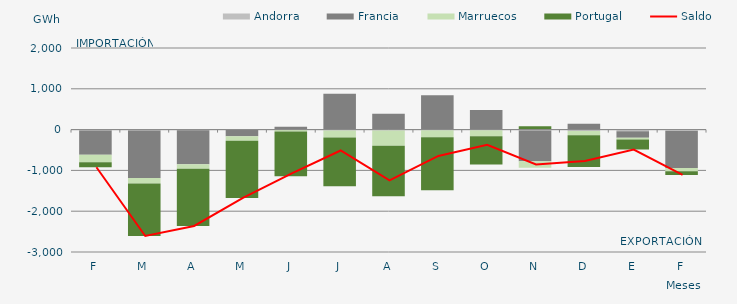
| Category | Andorra | Francia | Marruecos | Portugal |
|---|---|---|---|---|
| F | -21.206 | -592.499 | -187.112 | -122.026 |
| M | -23.108 | -1163.333 | -133.704 | -1286.701 |
| A | -14.627 | -836.505 | -105.478 | -1404.431 |
| M | -10.909 | -149.423 | -115.706 | -1398.852 |
| J | -2.08 | 70.4 | -42.701 | -1096.73 |
| J | -19.231 | 877.054 | -174.716 | -1194.709 |
| A | -19.938 | 386.697 | -376.794 | -1234.348 |
| S | -15.222 | 839.308 | -170.976 | -1297.757 |
| O | -13.493 | 479.877 | -148.522 | -692.604 |
| N | -23.834 | -750.522 | -163.216 | 84.596 |
| D | -34.648 | 145.481 | -106.176 | -774.962 |
| E | -40.623 | -161.618 | -38.221 | -248.586 |
| F | -34.3 | -904.557 | -79.926 | -93.294 |